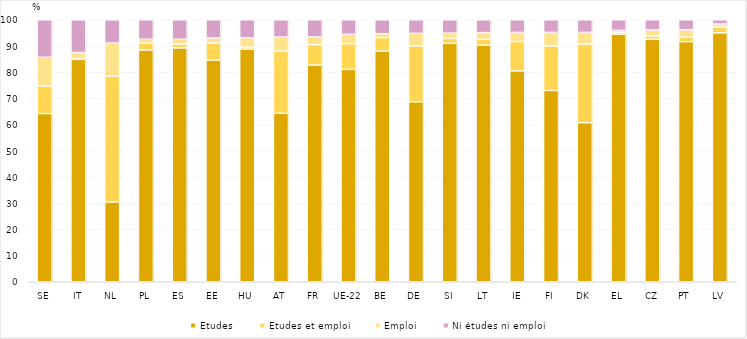
| Category | Etudes | Etudes et emploi | Emploi | Ni études ni emploi |
|---|---|---|---|---|
| SE | 64.201 | 10.488 | 10.966 | 14.344 |
| IT | 84.877 | 0.281 | 2.323 | 12.518 |
| NL | 30.466 | 48.013 | 12.595 | 8.925 |
| PL | 88.418 | 2.628 | 1.489 | 7.465 |
| ES | 89.247 | 1.4 | 1.912 | 7.44 |
| EE | 84.616 | 6.558 | 1.861 | 6.965 |
| HU | 88.805 | 0.767 | 3.515 | 6.913 |
| AT | 64.297 | 23.723 | 5.374 | 6.606 |
| FR | 82.721 | 7.748 | 2.956 | 6.575 |
| UE-22 | 81.049 | 9.8 | 3.603 | 6.281 |
| BE | 88.046 | 5.114 | 1.502 | 5.338 |
| DE | 68.704 | 21.309 | 4.792 | 5.195 |
| SI | 90.988 | 1.878 | 2.018 | 5.115 |
| LT | 90.264 | 2.271 | 2.556 | 4.909 |
| IE | 80.493 | 11.213 | 3.444 | 4.851 |
| FI | 73.01 | 16.955 | 5.19 | 4.844 |
| DK | 60.715 | 29.919 | 4.531 | 4.835 |
| EL | 94.478 | 0.628 | 0.829 | 4.066 |
| CZ | 92.591 | 1.191 | 2.307 | 3.911 |
| PT | 91.644 | 1.693 | 2.806 | 3.857 |
| LV | 95.012 | 2.22 | 1.142 | 1.626 |